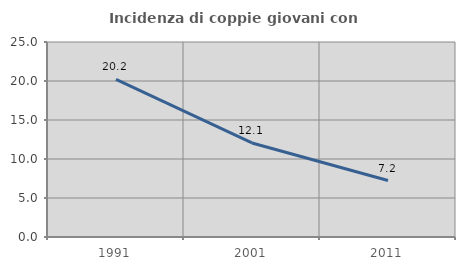
| Category | Incidenza di coppie giovani con figli |
|---|---|
| 1991.0 | 20.219 |
| 2001.0 | 12.053 |
| 2011.0 | 7.243 |